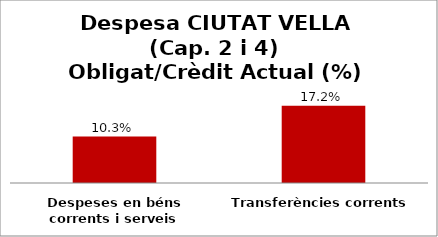
| Category | Series 0 |
|---|---|
| Despeses en béns corrents i serveis | 0.103 |
| Transferències corrents | 0.172 |